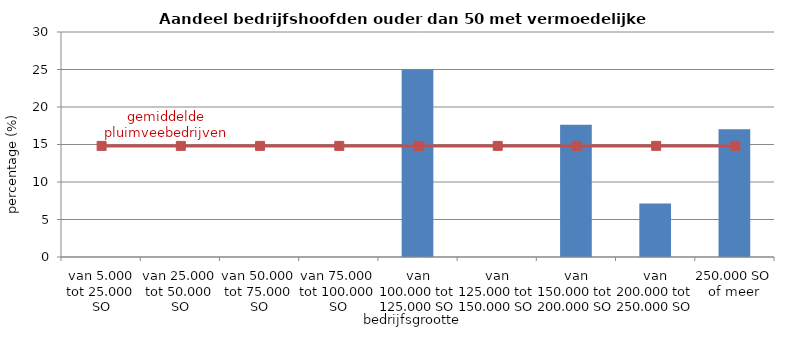
| Category | Series 0 |
|---|---|
| van 5.000 tot 25.000 SO | 0 |
| van 25.000 tot 50.000 SO | 0 |
| van 50.000 tot 75.000 SO | 0 |
| van 75.000 tot 100.000 SO | 0 |
| van 100.000 tot 125.000 SO | 25 |
| van 125.000 tot 150.000 SO | 0 |
| van 150.000 tot 200.000 SO | 17.647 |
| van 200.000 tot 250.000 SO | 7.143 |
| 250.000 SO of meer | 17.033 |